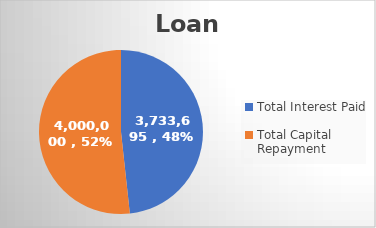
| Category | Series 0 |
|---|---|
| Total Interest Paid | 3733694.658 |
| Total Capital Repayment | 4000000 |